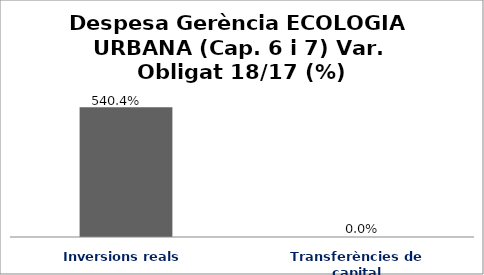
| Category | Series 0 |
|---|---|
| Inversions reals | 5.404 |
| Transferències de capital | 0 |